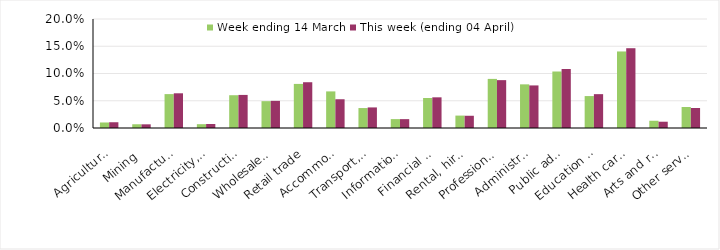
| Category | Week ending 14 March | This week (ending 04 April) |
|---|---|---|
| Agriculture, forestry and fishing | 0.01 | 0.011 |
| Mining | 0.007 | 0.007 |
| Manufacturing | 0.062 | 0.064 |
| Electricity, gas, water and waste services | 0.007 | 0.007 |
| Construction | 0.06 | 0.061 |
| Wholesale trade | 0.049 | 0.05 |
| Retail trade | 0.081 | 0.084 |
| Accommodation and food services | 0.067 | 0.053 |
| Transport, postal and warehousing | 0.037 | 0.038 |
| Information media and telecommunications | 0.016 | 0.016 |
| Financial and insurance services | 0.055 | 0.056 |
| Rental, hiring and real estate services | 0.023 | 0.022 |
| Professional, scientific and technical services | 0.09 | 0.088 |
| Administrative and support services | 0.08 | 0.078 |
| Public administration and safety | 0.104 | 0.108 |
| Education and training | 0.059 | 0.062 |
| Health care and social assistance | 0.14 | 0.146 |
| Arts and recreation services | 0.013 | 0.012 |
| Other services | 0.039 | 0.037 |